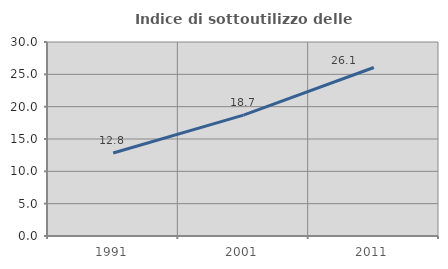
| Category | Indice di sottoutilizzo delle abitazioni  |
|---|---|
| 1991.0 | 12.835 |
| 2001.0 | 18.695 |
| 2011.0 | 26.052 |